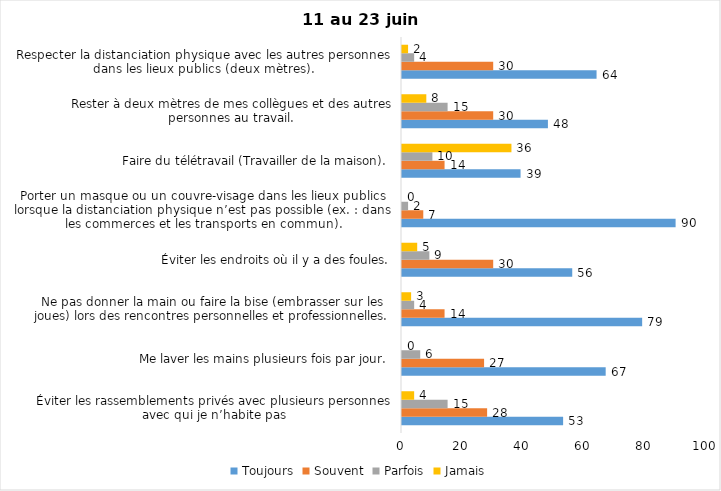
| Category | Toujours | Souvent | Parfois | Jamais |
|---|---|---|---|---|
| Éviter les rassemblements privés avec plusieurs personnes avec qui je n’habite pas | 53 | 28 | 15 | 4 |
| Me laver les mains plusieurs fois par jour. | 67 | 27 | 6 | 0 |
| Ne pas donner la main ou faire la bise (embrasser sur les joues) lors des rencontres personnelles et professionnelles. | 79 | 14 | 4 | 3 |
| Éviter les endroits où il y a des foules. | 56 | 30 | 9 | 5 |
| Porter un masque ou un couvre-visage dans les lieux publics lorsque la distanciation physique n’est pas possible (ex. : dans les commerces et les transports en commun). | 90 | 7 | 2 | 0 |
| Faire du télétravail (Travailler de la maison). | 39 | 14 | 10 | 36 |
| Rester à deux mètres de mes collègues et des autres personnes au travail. | 48 | 30 | 15 | 8 |
| Respecter la distanciation physique avec les autres personnes dans les lieux publics (deux mètres). | 64 | 30 | 4 | 2 |